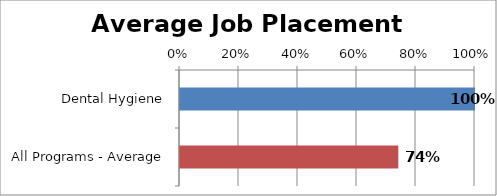
| Category | Series 0 |
|---|---|
| Dental Hygiene | 1 |
| All Programs - Average | 0.74 |